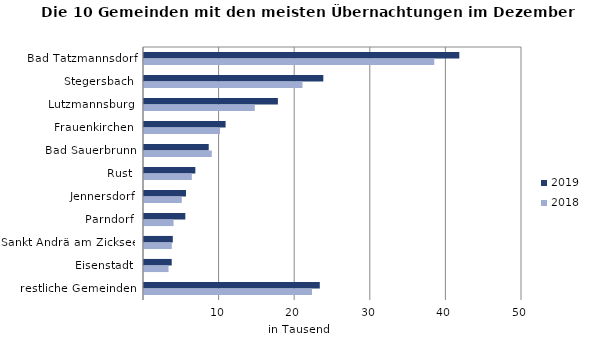
| Category | 2019 | 2018 |
|---|---|---|
| Bad Tatzmannsdorf | 41708 | 38396 |
| Stegersbach | 23719 | 20960 |
| Lutzmannsburg | 17710 | 14657 |
| Frauenkirchen | 10794 | 10056 |
| Bad Sauerbrunn | 8561 | 8963 |
| Rust | 6791 | 6326 |
| Jennersdorf | 5554 | 5000 |
| Parndorf | 5467 | 3914 |
| Sankt Andrä am Zicksee | 3810 | 3677 |
| Eisenstadt | 3665 | 3244 |
| restliche Gemeinden | 23252 | 22221 |